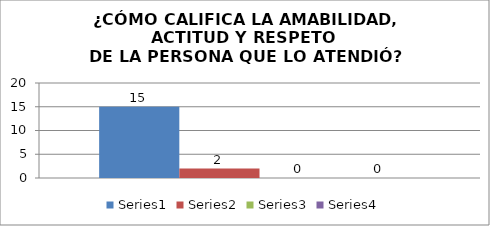
| Category | Series 0 | Series 1 | Series 2 | Series 3 |
|---|---|---|---|---|
| 0 | 15 | 2 | 0 | 0 |